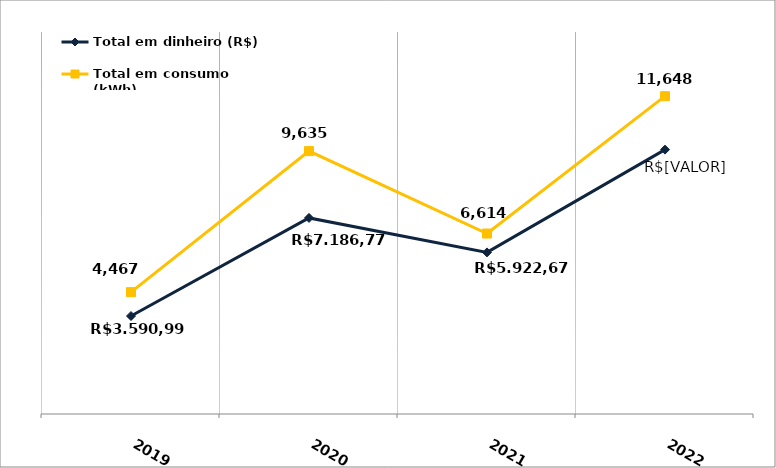
| Category | Total em dinheiro (R$) |
|---|---|
| 2019.0 | 3590.99 |
| 2020.0 | 7186.77 |
| 2021.0 | 5922.67 |
| 2022.0 | 9688.99 |